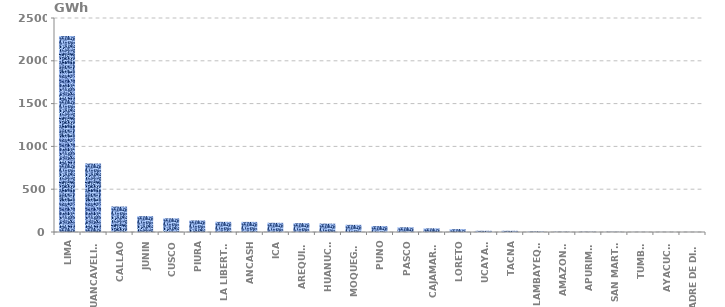
| Category | Series 0 |
|---|---|
| LIMA | 2290.174 |
| HUANCAVELICA | 800.043 |
| CALLAO | 297.73 |
| JUNIN | 185.315 |
| CUSCO | 160.184 |
| PIURA | 135.31 |
| LA LIBERTAD | 118.719 |
| ANCASH | 117.985 |
| ICA | 107.384 |
| AREQUIPA | 103.471 |
| HUANUCO | 97.88 |
| MOQUEGUA | 83.734 |
| PUNO | 69.237 |
| PASCO | 55.355 |
| CAJAMARCA | 42.873 |
| LORETO | 33.738 |
| UCAYALI | 14.147 |
| TACNA | 13.929 |
| LAMBAYEQUE | 6.159 |
| AMAZONAS | 3.185 |
| APURIMAC | 3.155 |
| SAN MARTÍN | 2.596 |
| TUMBES | 1.101 |
| AYACUCHO | 0.965 |
| MADRE DE DIOS | 0.505 |